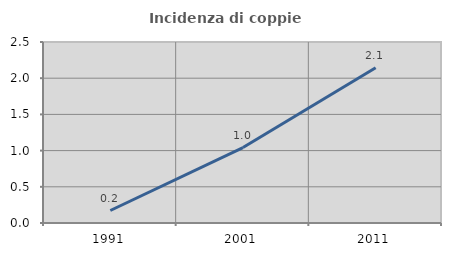
| Category | Incidenza di coppie miste |
|---|---|
| 1991.0 | 0.172 |
| 2001.0 | 1.042 |
| 2011.0 | 2.145 |